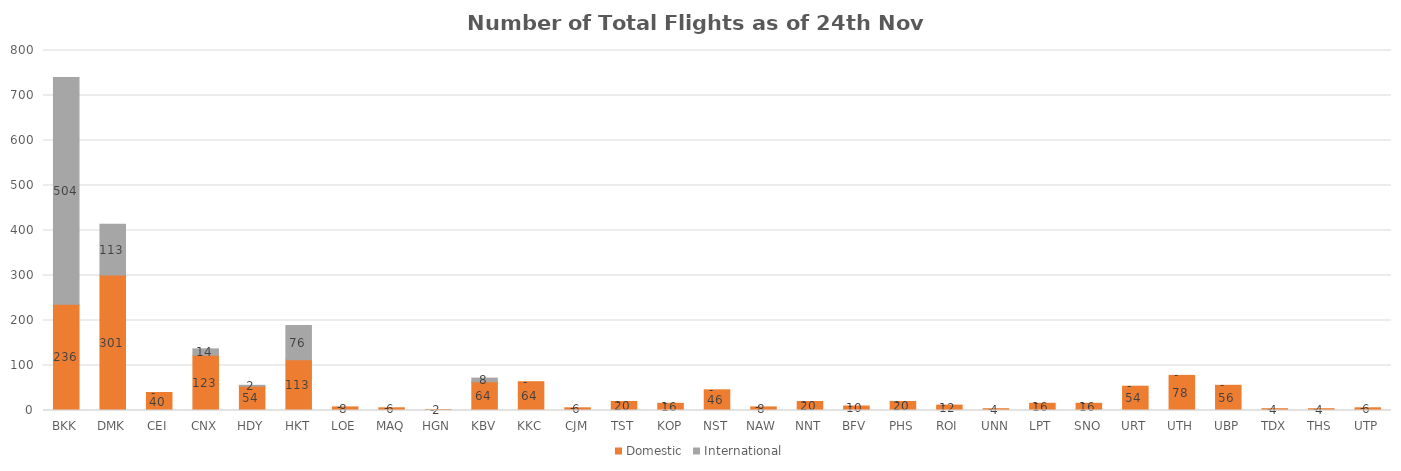
| Category | Domestic | International |
|---|---|---|
| BKK | 236 | 504 |
| DMK | 301 | 113 |
| CEI | 40 | 0 |
| CNX | 123 | 14 |
| HDY | 54 | 2 |
| HKT | 113 | 76 |
| LOE | 8 | 0 |
| MAQ | 6 | 0 |
| HGN | 2 | 0 |
| KBV | 64 | 8 |
| KKC | 64 | 0 |
| CJM | 6 | 0 |
| TST | 20 | 0 |
| KOP | 16 | 0 |
| NST | 46 | 0 |
| NAW | 8 | 0 |
| NNT | 20 | 0 |
| BFV | 10 | 0 |
| PHS | 20 | 0 |
| ROI | 12 | 0 |
| UNN | 4 | 0 |
| LPT | 16 | 0 |
| SNO | 16 | 0 |
| URT | 54 | 0 |
| UTH | 78 | 0 |
| UBP | 56 | 0 |
| TDX | 4 | 0 |
| THS | 4 | 0 |
| UTP | 6 | 0 |